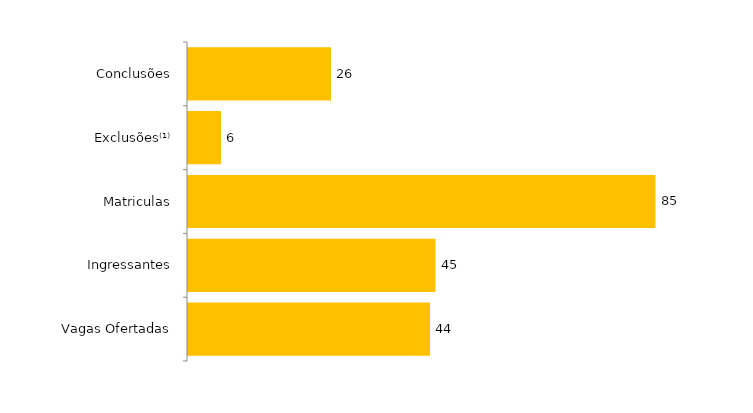
| Category | Total (2019) |
|---|---|
| Vagas Ofertadas | 44 |
| Ingressantes | 45 |
| Matriculas | 85 |
| Exclusões⁽¹⁾ | 6 |
| Conclusões | 26 |